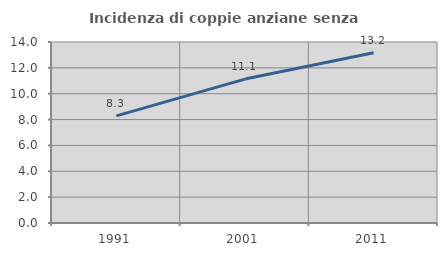
| Category | Incidenza di coppie anziane senza figli  |
|---|---|
| 1991.0 | 8.284 |
| 2001.0 | 11.131 |
| 2011.0 | 13.171 |